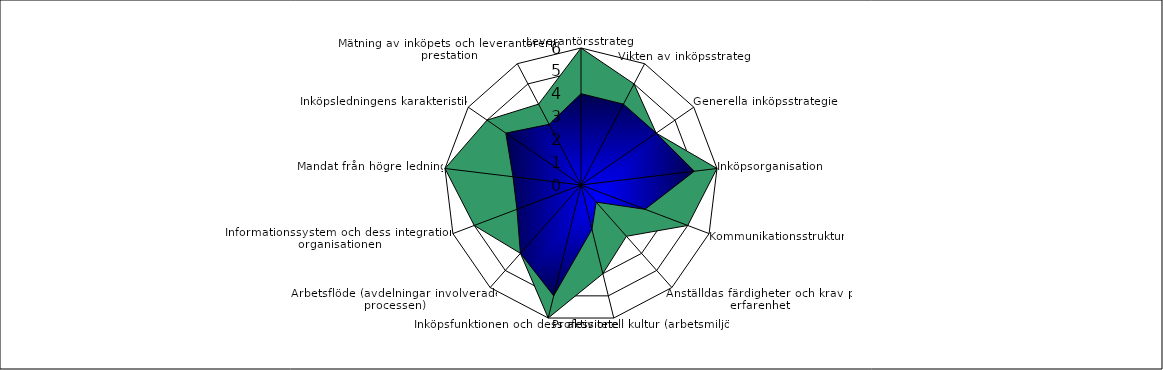
| Category | Series 1 | Series 0 |
|---|---|---|
| Leverantörsstrategi | 6 | 4 |
| Vikten av inköpsstrategi | 5 | 4 |
| Generella inköpsstrategier | 4 | 4 |
| Inköpsorganisation | 6 | 5 |
| Kommunikationsstruktur | 5 | 3 |
| Anställdas färdigheter och krav på erfarenhet | 3 | 1 |
| Professionell kultur (arbetsmiljö) | 4 | 2 |
| Inköpsfunktionen och dess aktiviteter | 6 | 5 |
| Arbetsflöde (avdelningar involverade i processen) | 4 | 4 |
| Informationssystem och dess integration i organisationen | 5 | 3 |
| Mandat från högre ledning | 6 | 3 |
| Inköpsledningens karakteristik | 5 | 4 |
| Mätning av inköpets och leverantörernas prestation | 4 | 3 |